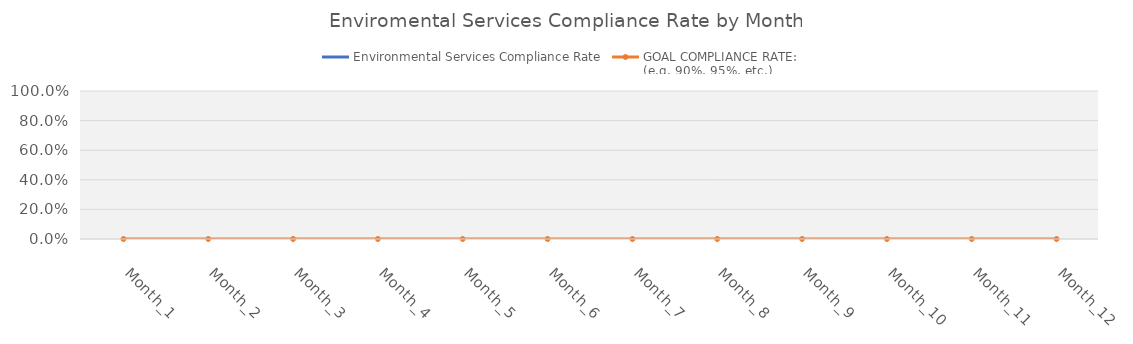
| Category | Environmental Services Compliance Rate | GOAL COMPLIANCE RATE:
(e.g. 90%, 95%, etc.) |
|---|---|---|
| Month_1 |  | 0 |
| Month_2 |  | 0 |
| Month_3 |  | 0 |
| Month_4 |  | 0 |
| Month_5 |  | 0 |
| Month_6 |  | 0 |
| Month_7 |  | 0 |
| Month_8 |  | 0 |
| Month_9 |  | 0 |
| Month_10 |  | 0 |
| Month_11 |  | 0 |
| Month_12 |  | 0 |